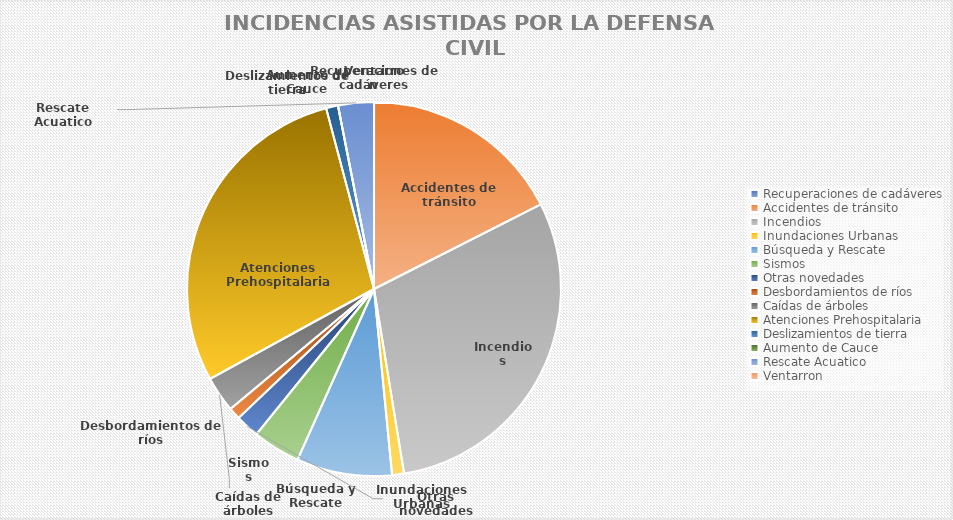
| Category | Series 0 |
|---|---|
| Recuperaciones de cadáveres | 0 |
| Accidentes de tránsito | 17 |
| Incendios | 29 |
| Inundaciones Urbanas | 1 |
| Búsqueda y Rescate | 8 |
| Sismos | 4 |
| Otras novedades | 2 |
| Desbordamientos de ríos | 1 |
| Caídas de árboles | 3 |
| Atenciones Prehospitalaria | 28 |
| Deslizamientos de tierra | 1 |
| Aumento de Cauce | 0 |
| Rescate Acuatico | 3 |
| Ventarron | 0 |